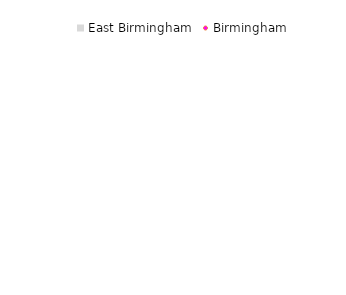
| Category | East Birmingham |
|---|---|
| Economically active persons  | 5.076 |
| Employees working full-time | 4.898 |
| Employees working part-time | 11.221 |
| Self employed | 32.507 |
| Unemployed | -25.167 |
| Full-time students (economically active) | 9.294 |